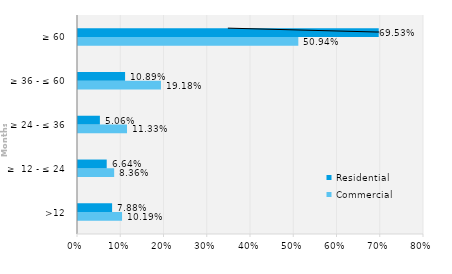
| Category | Commercial | Residential |
|---|---|---|
| >12 | 0.102 | 0.079 |
| ≥  12 - ≤ 24 | 0.084 | 0.066 |
| ≥ 24 - ≤ 36 | 0.113 | 0.051 |
| ≥ 36 - ≤ 60 | 0.192 | 0.109 |
| ≥ 60 | 0.509 | 0.695 |